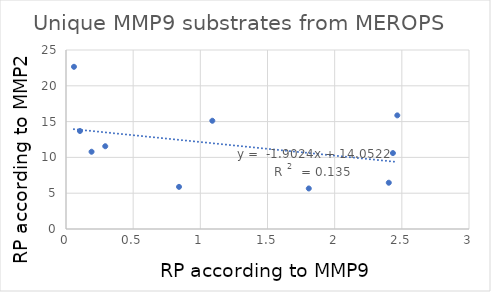
| Category | Series 0 |
|---|---|
| 0.841352 | 5.884 |
| 1.8073487 | 5.662 |
| 1.0892504 | 15.117 |
| 0.2922061 | 11.559 |
| 2.4029523 | 6.464 |
| 0.0593655 | 22.653 |
| 2.4336404 | 10.603 |
| 2.4663045 | 15.87 |
| 0.1902472 | 10.79 |
| 0.1038706 | 13.689 |